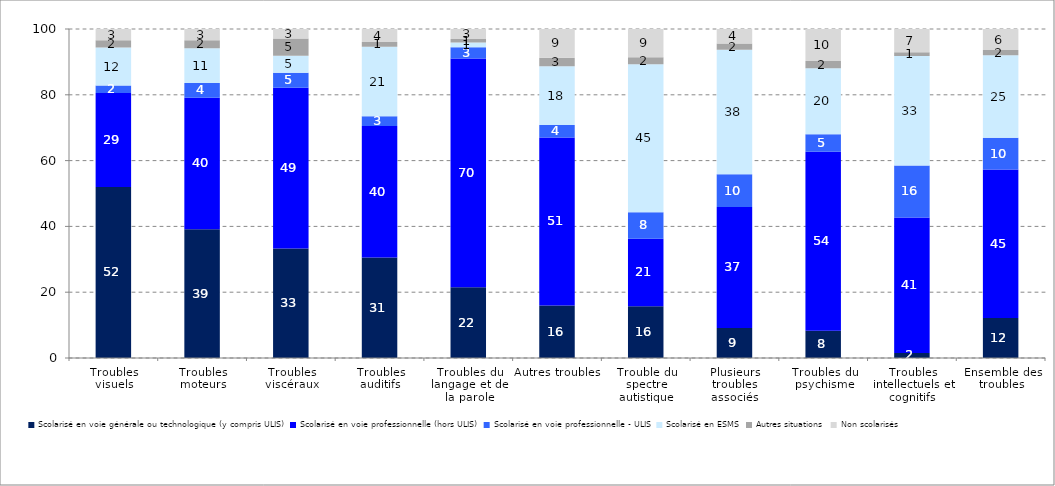
| Category | Scolarisé en voie générale ou technologique (y compris ULIS) | Scolarisé en voie professionnelle (hors ULIS) | Scolarisé en voie professionnelle - ULIS | Scolarisé en ESMS | Autres situations | Non scolarisés |
|---|---|---|---|---|---|---|
| Troubles visuels | 51.986 | 28.596 | 2.209 | 11.568 | 2.187 | 3.454 |
| Troubles moteurs | 39.113 | 40.026 | 4.421 | 10.599 | 2.403 | 3.439 |
| Troubles viscéraux | 33.271 | 48.862 | 4.544 | 5.201 | 5.202 | 2.921 |
| Troubles auditifs | 30.512 | 40.013 | 2.926 | 21.175 | 1.403 | 3.972 |
| Troubles du langage et de la parole | 21.517 | 69.5 | 3.443 | 1.457 | 1.032 | 3.052 |
| Autres troubles | 15.983 | 51.03 | 3.818 | 17.869 | 2.536 | 8.764 |
| Trouble du spectre autistique | 15.755 | 20.517 | 8.053 | 44.958 | 2.164 | 8.552 |
| Plusieurs troubles associés | 9.144 | 36.738 | 9.937 | 37.846 | 1.908 | 4.425 |
| Troubles du psychisme | 8.309 | 54.415 | 5.252 | 20.068 | 2.193 | 9.763 |
| Troubles intellectuels et cognitifs | 1.534 | 41.182 | 15.786 | 33.272 | 1.177 | 7.05 |
| Ensemble des troubles | 12.148 | 45.181 | 9.631 | 25.034 | 1.604 | 6.403 |